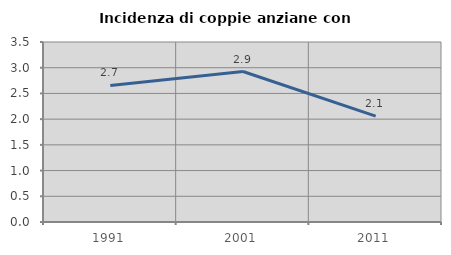
| Category | Incidenza di coppie anziane con figli |
|---|---|
| 1991.0 | 2.655 |
| 2001.0 | 2.926 |
| 2011.0 | 2.059 |